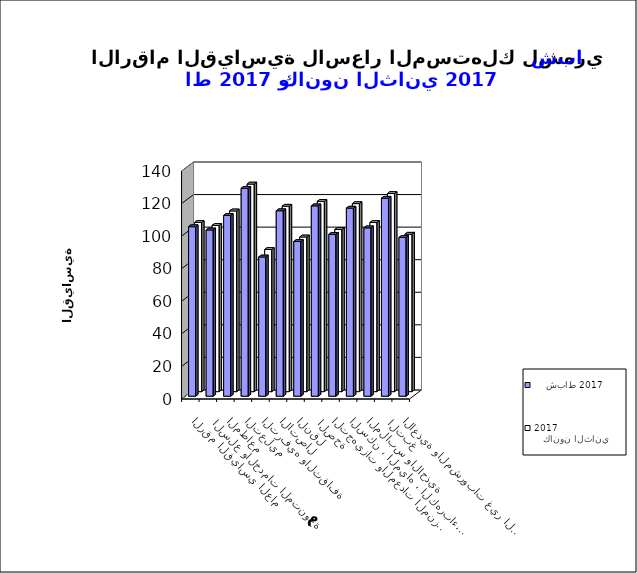
| Category |     شباط 2017      |    كانون الثاني 2017      |
|---|---|---|
| الاغذية والمشروبات غير الكحولية | 97.5 | 96.7 |
|  التبغ | 121.6 | 121.7 |
| الملابس والاحذية | 103.4 | 103.9 |
| السكن ، المياه ، الكهرباء، الغاز  | 115.5 | 115.5 |
| التجهيزات والمعدات المنزلية والصيانة | 99.4 | 99.6 |
|  الصحة | 116.9 | 116.9 |
| النقل | 95 | 95 |
| الاتصال | 113.9 | 113.9 |
| الترفيه والثقافة | 85.5 | 87.3 |
| التعليم | 127.7 | 127.5 |
| المطاعم  | 111 | 111 |
|  السلع والخدمات المتنوعة | 102.1 | 102.1 |
| الرقم القياسي العام | 104.1 | 103.9 |